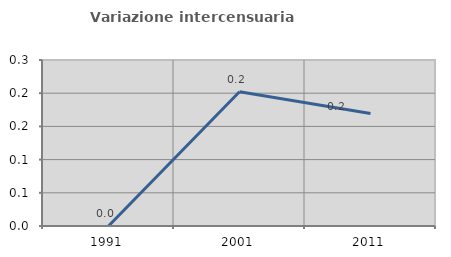
| Category | Variazione intercensuaria annua |
|---|---|
| 1991.0 | 0 |
| 2001.0 | 0.202 |
| 2011.0 | 0.17 |